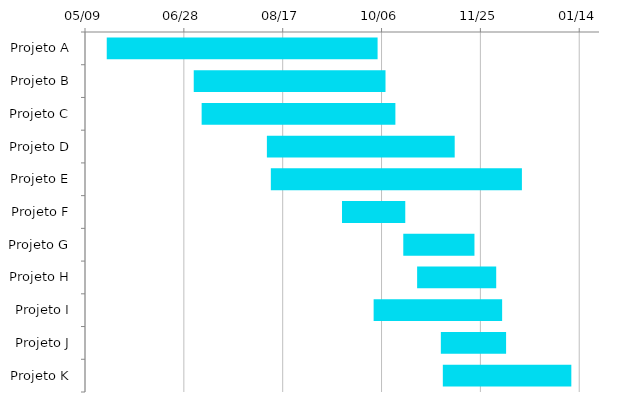
| Category | Início | Dias |
|---|---|---|
| Projeto A | 2022-05-20 | 137 |
| Projeto B | 2022-07-03 | 97 |
| Projeto C | 2022-07-07 | 98 |
| Projeto D | 2022-08-09 | 95 |
| Projeto E | 2022-08-11 | 127 |
| Projeto F | 2022-09-16 | 32 |
| Projeto G | 2022-10-17 | 36 |
| Projeto H | 2022-10-24 | 40 |
| Projeto I | 2022-10-02 | 65 |
| Projeto J | 2022-11-05 | 33 |
| Projeto K | 2022-11-06 | 65 |